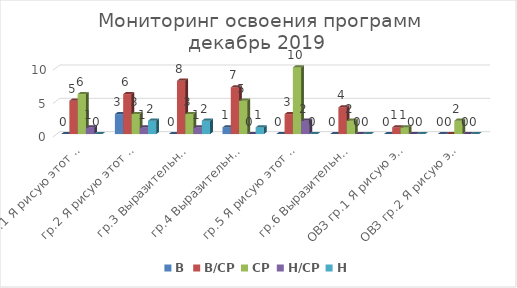
| Category | В | В/СР | СР | Н/СР | Н |
|---|---|---|---|---|---|
| гр.1 Я рисую этот мир | 0 | 5 | 6 | 1 | 0 |
| гр.2 Я рисую этот мир | 3 | 6 | 3 | 1 | 2 |
| гр.3 Выразительные возможности живописи и рисунка | 0 | 8 | 3 | 1 | 2 |
| гр.4 Выразительные возможности живописи и рисунка | 1 | 7 | 5 | 0 | 1 |
| гр.5 Я рисую этот мир | 0 | 3 | 10 | 2 | 0 |
| гр.6 Выразительные возможности живописи и рисунка | 0 | 4 | 2 | 0 | 0 |
| ОВЗ гр.1 Я рисую этот мир | 0 | 1 | 1 | 0 | 0 |
| ОВЗ гр.2 Я рисую этот мир | 0 | 0 | 2 | 0 | 0 |